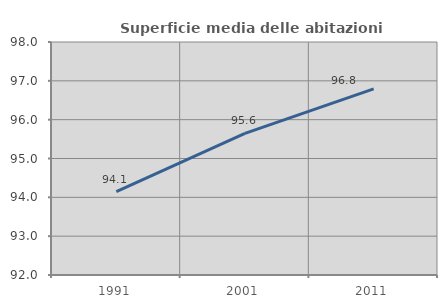
| Category | Superficie media delle abitazioni occupate |
|---|---|
| 1991.0 | 94.149 |
| 2001.0 | 95.649 |
| 2011.0 | 96.791 |